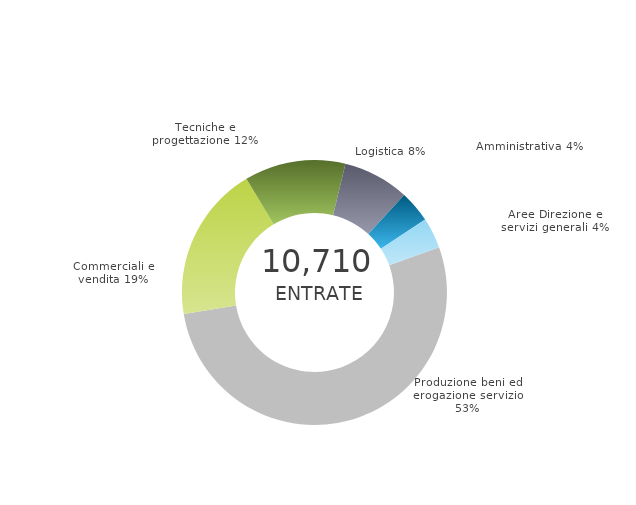
| Category | Series 0 | Series 1 |
|---|---|---|
| Produzione beni ed erogazione servizio | 0 | 0.53 |
| Commerciali e vendita | 0 | 0.19 |
| Tecniche e progettazione | 0 | 0.123 |
| Logistica | 0 | 0.081 |
| Amministrativa | 0 | 0.039 |
| Aree Direzione e servizi generali | 0 | 0.037 |